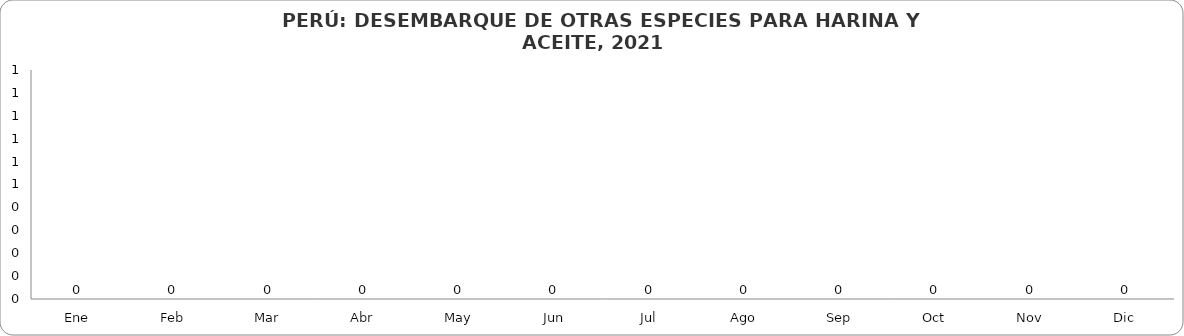
| Category | Total |
|---|---|
| Ene | 0 |
| Feb | 0 |
| Mar | 0 |
| Abr | 0 |
| May | 0 |
| Jun | 0 |
| Jul | 0 |
| Ago | 0 |
| Sep | 0 |
| Oct | 0 |
| Nov | 0 |
| Dic | 0 |